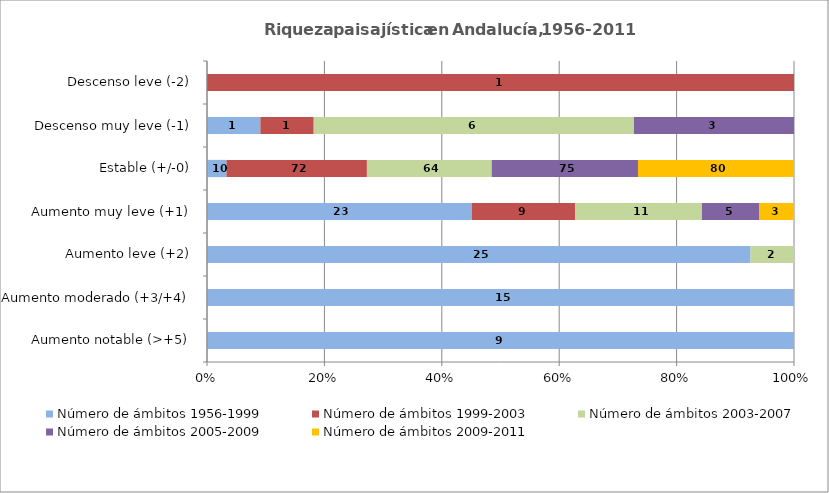
| Category | Número de ámbitos 1956-1999 | Número de ámbitos 1999-2003 | Número de ámbitos 2003-2007 | Número de ámbitos 2005-2009 | Número de ámbitos 2009-2011 |
|---|---|---|---|---|---|
| Aumento notable (>+5) | 9 | 0 | 0 | 0 | 0 |
| Aumento moderado (+3/+4) | 15 | 0 | 0 | 0 | 0 |
| Aumento leve (+2) | 25 | 0 | 2 | 0 | 0 |
| Aumento muy leve (+1) | 23 | 9 | 11 | 5 | 3 |
| Estable (+/-0) | 10 | 72 | 64 | 75 | 80 |
| Descenso muy leve (-1) | 1 | 1 | 6 | 3 | 0 |
| Descenso leve (-2) | 0 | 1 | 0 | 0 | 0 |